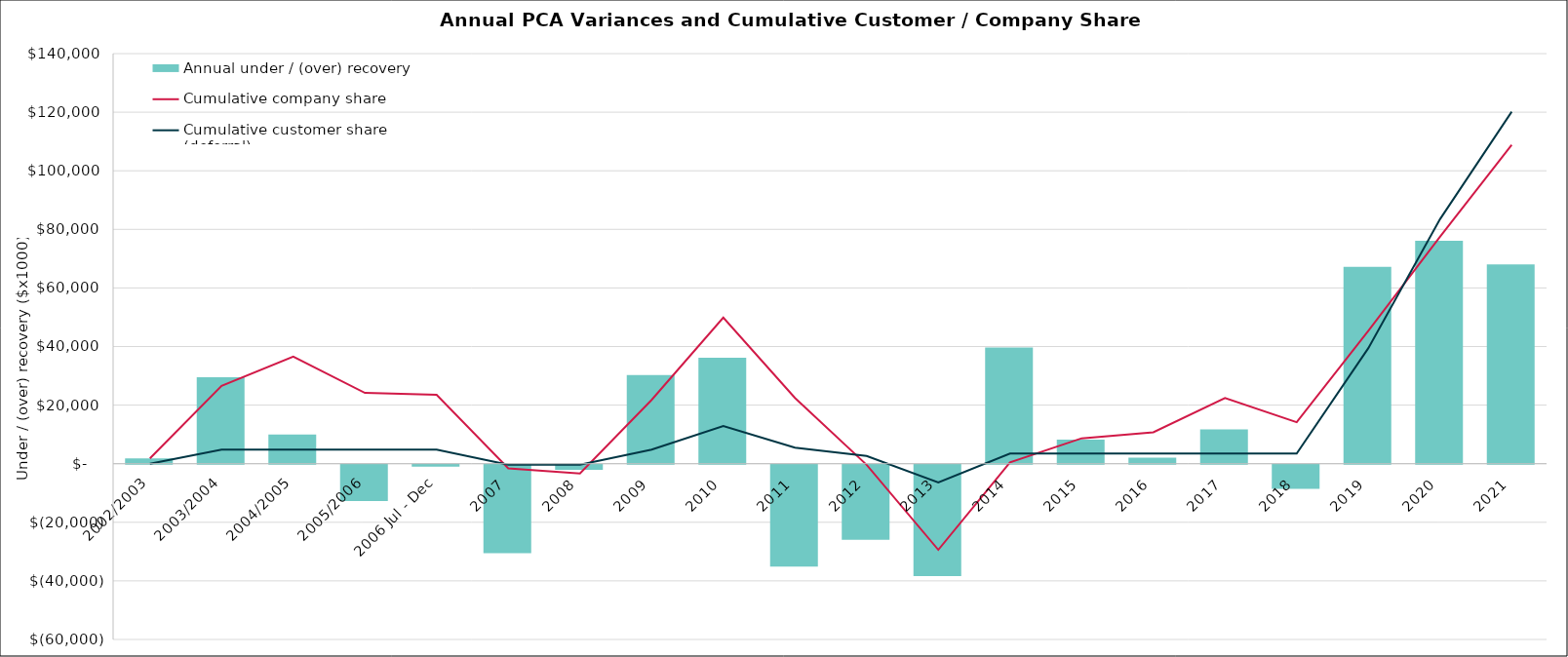
| Category |  Annual under / (over) recovery  |
|---|---|
| 2002/2003 | 1828.298 |
| 2003/2004 | 29551.324 |
| 2004/2005 | 9957.561 |
| 2005/2006 | -12375.488 |
| 2006 Jul - Dec | -671.033 |
| 2007 | -30212.671 |
| 2008 | -1764.924 |
| 2009 | 30270.097 |
| 2010 | 36163.528 |
| 2011 | -34827.818 |
| 2012 | -25644.564 |
| 2013 | -38038.883 |
| 2014 | 39647.675 |
| 2015 | 8232.968 |
| 2016 | 2058.382 |
| 2017 | 11694.279 |
| 2018 | -8244.461 |
| 2019 | 67232.135 |
| 2020 | 76118.659 |
| 2021 | 68002.24 |